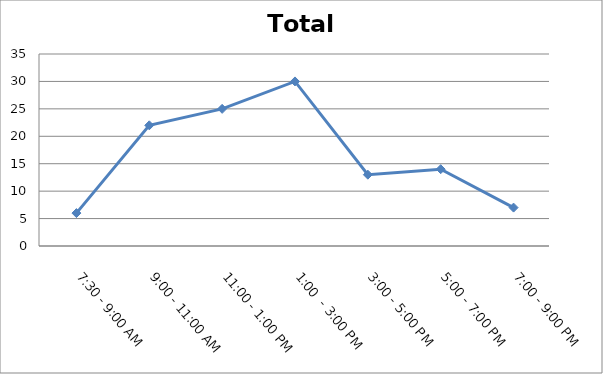
| Category | Total |
|---|---|
| 7:30 - 9:00 AM | 6 |
| 9:00 - 11:00 AM | 22 |
| 11:00 - 1:00 PM | 25 |
| 1:00  - 3:00 PM | 30 |
| 3:00 - 5:00 PM | 13 |
| 5:00 - 7:00 PM | 14 |
| 7:00 - 9:00 PM | 7 |